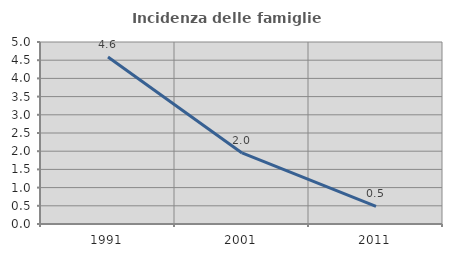
| Category | Incidenza delle famiglie numerose |
|---|---|
| 1991.0 | 4.588 |
| 2001.0 | 1.952 |
| 2011.0 | 0.483 |